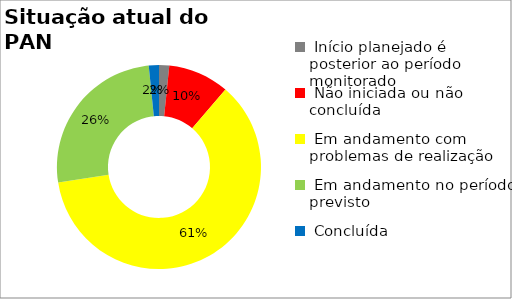
| Category | Series 0 |
|---|---|
|  Início planejado é posterior ao período monitorado | 0.016 |
|  Não iniciada ou não concluída | 0.097 |
|  Em andamento com problemas de realização | 0.613 |
|  Em andamento no período previsto  | 0.258 |
|  Concluída | 0.016 |